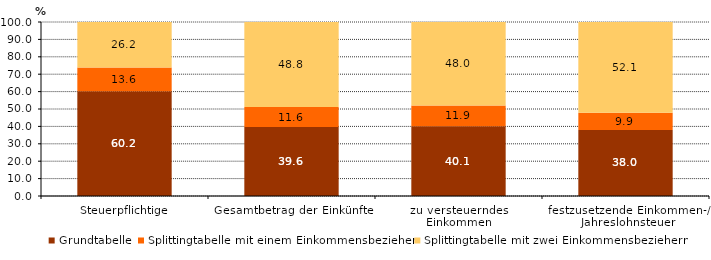
| Category | Grundtabelle | Splittingtabelle mit einem Einkommensbezieher | Splittingtabelle mit zwei Einkommensbeziehern |
|---|---|---|---|
| Steuerpflichtige | 60.2 | 13.6 | 26.2 |
| Gesamtbetrag der Einkünfte | 39.6 | 11.6 | 48.8 |
| zu versteuerndes 
Einkommen | 40.1 | 11.9 | 48 |
| festzusetzende Einkommen-/ Jahreslohnsteuer | 38 | 9.9 | 52.1 |